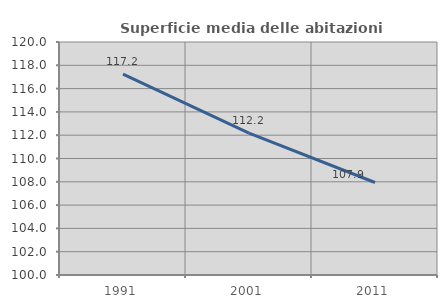
| Category | Superficie media delle abitazioni occupate |
|---|---|
| 1991.0 | 117.239 |
| 2001.0 | 112.175 |
| 2011.0 | 107.94 |